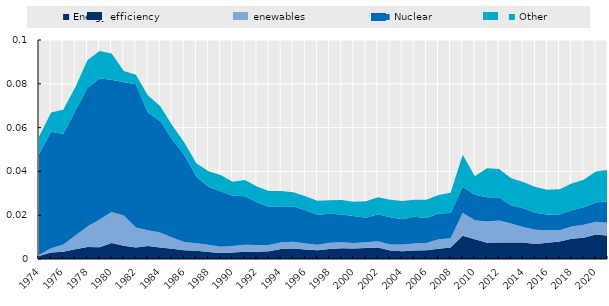
| Category |  Energy efficiency  |  Renewables  |  Nuclear  |  Other  |
|---|---|---|---|---|
| 1974.0 | 0.001 | 0.001 | 0.046 | 0.008 |
| 1975.0 | 0.003 | 0.002 | 0.053 | 0.009 |
| 1976.0 | 0.003 | 0.003 | 0.05 | 0.011 |
| 1977.0 | 0.004 | 0.006 | 0.057 | 0.011 |
| 1978.0 | 0.005 | 0.009 | 0.063 | 0.013 |
| 1979.0 | 0.005 | 0.013 | 0.064 | 0.013 |
| 1980.0 | 0.007 | 0.014 | 0.06 | 0.012 |
| 1981.0 | 0.006 | 0.014 | 0.061 | 0.005 |
| 1982.0 | 0.005 | 0.009 | 0.065 | 0.004 |
| 1983.0 | 0.006 | 0.007 | 0.054 | 0.008 |
| 1984.0 | 0.005 | 0.007 | 0.051 | 0.007 |
| 1985.0 | 0.005 | 0.005 | 0.045 | 0.006 |
| 1986.0 | 0.004 | 0.004 | 0.04 | 0.006 |
| 1987.0 | 0.004 | 0.003 | 0.03 | 0.006 |
| 1988.0 | 0.003 | 0.003 | 0.027 | 0.007 |
| 1989.0 | 0.003 | 0.003 | 0.025 | 0.007 |
| 1990.0 | 0.003 | 0.003 | 0.023 | 0.006 |
| 1991.0 | 0.003 | 0.003 | 0.022 | 0.007 |
| 1992.0 | 0.003 | 0.003 | 0.019 | 0.007 |
| 1993.0 | 0.004 | 0.003 | 0.017 | 0.007 |
| 1994.0 | 0.005 | 0.003 | 0.016 | 0.007 |
| 1995.0 | 0.005 | 0.003 | 0.016 | 0.007 |
| 1996.0 | 0.004 | 0.003 | 0.015 | 0.006 |
| 1997.0 | 0.004 | 0.003 | 0.014 | 0.006 |
| 1998.0 | 0.005 | 0.003 | 0.013 | 0.006 |
| 1999.0 | 0.005 | 0.003 | 0.013 | 0.007 |
| 2000.0 | 0.005 | 0.003 | 0.012 | 0.006 |
| 2001.0 | 0.005 | 0.003 | 0.011 | 0.008 |
| 2002.0 | 0.005 | 0.003 | 0.012 | 0.008 |
| 2003.0 | 0.004 | 0.003 | 0.012 | 0.008 |
| 2004.0 | 0.004 | 0.003 | 0.011 | 0.008 |
| 2005.0 | 0.004 | 0.003 | 0.012 | 0.008 |
| 2006.0 | 0.004 | 0.003 | 0.011 | 0.008 |
| 2007.0 | 0.005 | 0.004 | 0.012 | 0.008 |
| 2008.0 | 0.005 | 0.004 | 0.012 | 0.009 |
| 2009.0 | 0.011 | 0.011 | 0.012 | 0.015 |
| 2010.0 | 0.009 | 0.009 | 0.012 | 0.008 |
| 2011.0 | 0.007 | 0.01 | 0.011 | 0.013 |
| 2012.0 | 0.007 | 0.01 | 0.011 | 0.013 |
| 2013.0 | 0.008 | 0.009 | 0.008 | 0.012 |
| 2014.0 | 0.008 | 0.007 | 0.009 | 0.012 |
| 2015.0 | 0.007 | 0.007 | 0.008 | 0.012 |
| 2016.0 | 0.007 | 0.006 | 0.007 | 0.011 |
| 2017.0 | 0.008 | 0.005 | 0.007 | 0.012 |
| 2018.0 | 0.009 | 0.006 | 0.008 | 0.012 |
| 2019.0 | 0.01 | 0.006 | 0.008 | 0.013 |
| 2020.0 | 0.011 | 0.006 | 0.009 | 0.014 |
| 2021.0 | 0.011 | 0.006 | 0.01 | 0.014 |